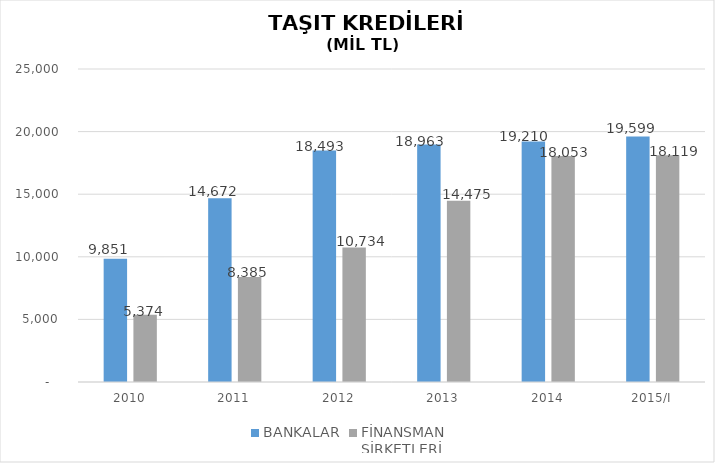
| Category | BANKALAR | FİNANSMAN 
ŞİRKETLERİ |
|---|---|---|
| 2010 | 9850.819 | 5374 |
| 2011 | 14672.044 | 8385 |
| 2012 | 18492.664 | 10734 |
| 2013 | 18963.054 | 14475 |
| 2014 | 19210.334 | 18053 |
| 2015/I | 19599 | 18119 |